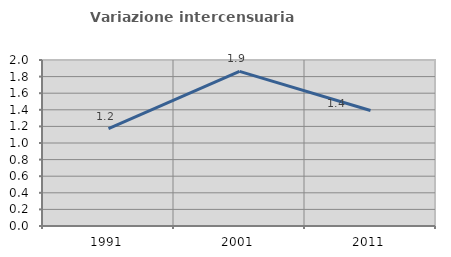
| Category | Variazione intercensuaria annua |
|---|---|
| 1991.0 | 1.175 |
| 2001.0 | 1.864 |
| 2011.0 | 1.391 |